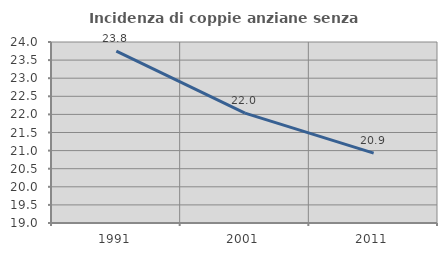
| Category | Incidenza di coppie anziane senza figli  |
|---|---|
| 1991.0 | 23.75 |
| 2001.0 | 22.034 |
| 2011.0 | 20.93 |